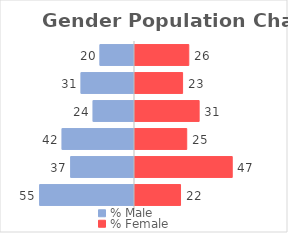
| Category | % Male | % Female |
|---|---|---|
| 18-22 years | -0.096 | 0.149 |
| 23-27 years | -0.148 | 0.132 |
| 28-32 years | -0.115 | 0.178 |
| 33-37 years | -0.201 | 0.144 |
| 38-42 years | -0.177 | 0.27 |
| 42+ years | -0.263 | 0.126 |